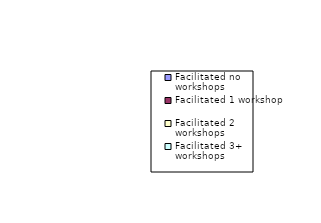
| Category | Series 0 |
|---|---|
| Facilitated no workshops | 0 |
| Facilitated 1 workshop | 0 |
| Facilitated 2 workshops | 0 |
| Facilitated 3+ workshops | 0 |